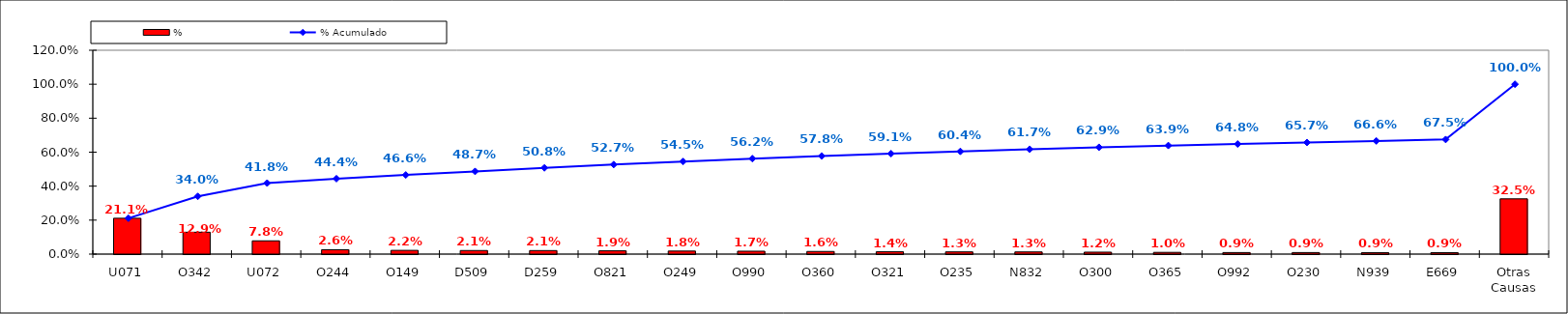
| Category | % |
|---|---|
| U071 | 0.211 |
| O342 | 0.129 |
| U072 | 0.078 |
| O244 | 0.026 |
| O149 | 0.022 |
| D509 | 0.021 |
| D259 | 0.021 |
| O821 | 0.019 |
| O249 | 0.018 |
| O990 | 0.017 |
| O360 | 0.016 |
| O321 | 0.014 |
| O235 | 0.013 |
| N832 | 0.013 |
| O300 | 0.012 |
| O365 | 0.01 |
| O992 | 0.009 |
| O230 | 0.009 |
| N939 | 0.009 |
| E669 | 0.009 |
| Otras Causas | 0.325 |